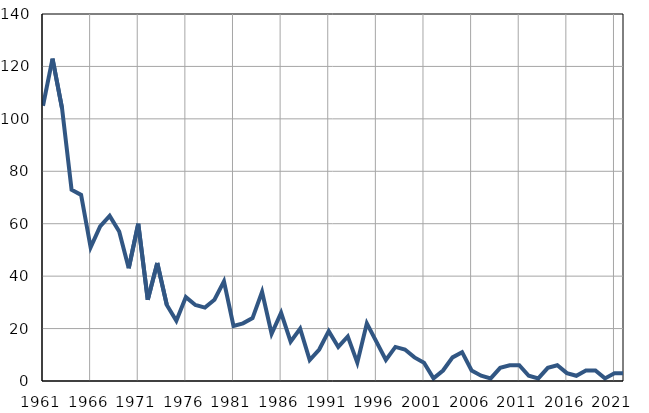
| Category | Infants
deaths |
|---|---|
| 1961.0 | 105 |
| 1962.0 | 123 |
| 1963.0 | 104 |
| 1964.0 | 73 |
| 1965.0 | 71 |
| 1966.0 | 51 |
| 1967.0 | 59 |
| 1968.0 | 63 |
| 1969.0 | 57 |
| 1970.0 | 43 |
| 1971.0 | 60 |
| 1972.0 | 31 |
| 1973.0 | 45 |
| 1974.0 | 29 |
| 1975.0 | 23 |
| 1976.0 | 32 |
| 1977.0 | 29 |
| 1978.0 | 28 |
| 1979.0 | 31 |
| 1980.0 | 38 |
| 1981.0 | 21 |
| 1982.0 | 22 |
| 1983.0 | 24 |
| 1984.0 | 34 |
| 1985.0 | 18 |
| 1986.0 | 26 |
| 1987.0 | 15 |
| 1988.0 | 20 |
| 1989.0 | 8 |
| 1990.0 | 12 |
| 1991.0 | 19 |
| 1992.0 | 13 |
| 1993.0 | 17 |
| 1994.0 | 7 |
| 1995.0 | 22 |
| 1996.0 | 15 |
| 1997.0 | 8 |
| 1998.0 | 13 |
| 1999.0 | 12 |
| 2000.0 | 9 |
| 2001.0 | 7 |
| 2002.0 | 1 |
| 2003.0 | 4 |
| 2004.0 | 9 |
| 2005.0 | 11 |
| 2006.0 | 4 |
| 2007.0 | 2 |
| 2008.0 | 1 |
| 2009.0 | 5 |
| 2010.0 | 6 |
| 2011.0 | 6 |
| 2012.0 | 2 |
| 2013.0 | 1 |
| 2014.0 | 5 |
| 2015.0 | 6 |
| 2016.0 | 3 |
| 2017.0 | 2 |
| 2018.0 | 4 |
| 2019.0 | 4 |
| 2020.0 | 1 |
| 2021.0 | 3 |
| 2022.0 | 3 |